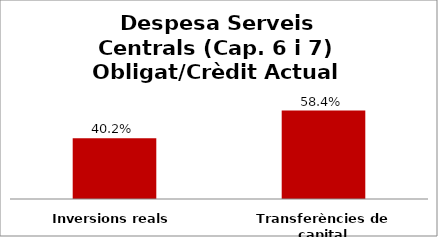
| Category | Series 0 |
|---|---|
| Inversions reals | 0.402 |
| Transferències de capital | 0.584 |